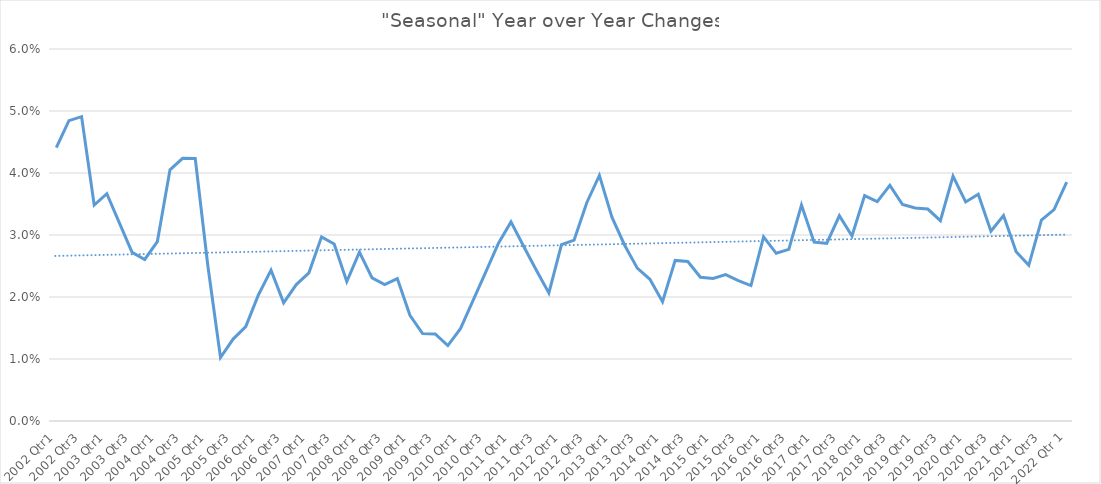
| Category | "Seasonal" Year over Year Changes |
|---|---|
| 2002 Qtr1 | 0.044 |
| 2002 Qtr2 | 0.048 |
| 2002 Qtr3 | 0.049 |
| 2002 Qtr4 | 0.035 |
| 2003 Qtr1 | 0.037 |
| 2003 Qtr2 | 0.032 |
| 2003 Qtr3 | 0.027 |
| 2003 Qtr4 | 0.026 |
| 2004 Qtr1 | 0.029 |
| 2004 Qtr2 | 0.041 |
| 2004 Qtr3 | 0.042 |
| 2004 Qtr4 | 0.042 |
| 2005 Qtr1 | 0.025 |
| 2005 Qtr2 | 0.01 |
| 2005 Qtr3 | 0.013 |
| 2005 Qtr4 | 0.015 |
| 2006 Qtr1 | 0.02 |
| 2006 Qtr2 | 0.024 |
| 2006 Qtr3 | 0.019 |
| 2006 Qtr4 | 0.022 |
| 2007 Qtr1 | 0.024 |
| 2007 Qtr2 | 0.03 |
| 2007 Qtr3 | 0.029 |
| 2007 Qtr4 | 0.023 |
| 2008 Qtr1 | 0.027 |
| 2008 Qtr2 | 0.023 |
| 2008 Qtr3 | 0.022 |
| 2008 Qtr4 | 0.023 |
| 2009 Qtr1 | 0.017 |
| 2009 Qtr2 | 0.014 |
| 2009 Qtr3 | 0.014 |
| 2009 Qtr4 | 0.012 |
| 2010 Qtr1 | 0.015 |
| 2010 Qtr2 | 0.019 |
| 2010 Qtr3 | 0.024 |
| 2010 Qtr4 | 0.029 |
| 2011 Qtr1 | 0.032 |
| 2011 Qtr2 | 0.028 |
| 2011 Qtr3 | 0.024 |
| 2011 Qtr4 | 0.021 |
| 2012 Qtr1 | 0.028 |
| 2012 Qtr2 | 0.029 |
| 2012 Qtr3 | 0.035 |
| 2012 Qtr4 | 0.04 |
| 2013 Qtr1 | 0.033 |
| 2013 Qtr2 | 0.028 |
| 2013 Qtr3 | 0.025 |
| 2013 Qtr4 | 0.023 |
| 2014 Qtr1 | 0.019 |
| 2014 Qtr2 | 0.026 |
| 2014 Qtr3 | 0.026 |
| 2014 Qtr4 | 0.023 |
| 2015 Qtr1 | 0.023 |
| 2015 Qtr2 | 0.024 |
| 2015 Qtr3 | 0.023 |
| 2015 Qtr4 | 0.022 |
| 2016 Qtr1 | 0.03 |
| 2016 Qtr2 | 0.027 |
| 2016 Qtr3 | 0.028 |
| 2016 Qtr4 | 0.035 |
| 2017 Qtr1 | 0.029 |
| 2017 Qtr2 | 0.029 |
| 2017 Qtr3 | 0.033 |
| 2017 Qtr4 | 0.03 |
| 2018 Qtr1 | 0.036 |
| 2018 Qtr2 | 0.035 |
| 2018 Qtr3 | 0.038 |
| 2018 Qtr4 | 0.035 |
| 2019 Qtr1 | 0.034 |
| 2019 Qtr2 | 0.034 |
| 2019 Qtr3 | 0.032 |
| 2019 Qtr4 | 0.039 |
| 2020 Qtr1 | 0.035 |
| 2020 Qtr2 | 0.037 |
| 2020 Qtr3 | 0.031 |
| 2020 Qtr4 | 0.033 |
| 2021 Qtr1 | 0.027 |
| 2021 Qtr2 | 0.025 |
| 2021 Qtr3 | 0.032 |
| 2021 Qtr4 | 0.034 |
| 2022 Qtr 1 | 0.039 |